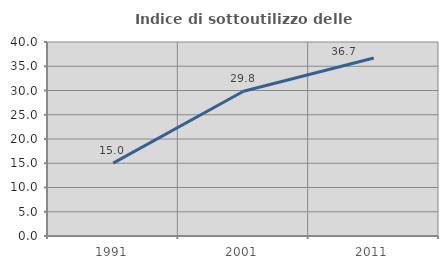
| Category | Indice di sottoutilizzo delle abitazioni  |
|---|---|
| 1991.0 | 15.033 |
| 2001.0 | 29.841 |
| 2011.0 | 36.691 |